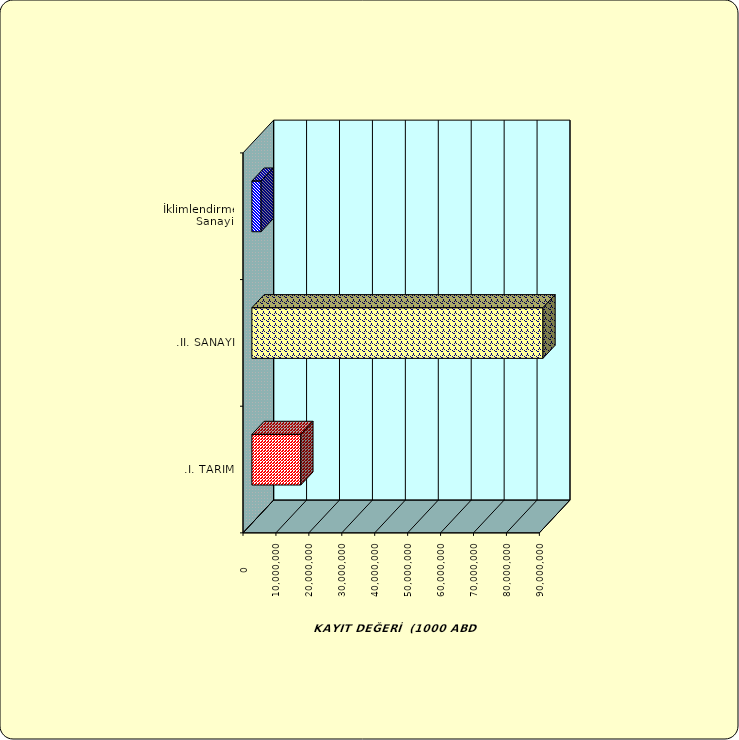
| Category | Series 0 |
|---|---|
| .I. TARIM | 14856409.396 |
| .II. SANAYİ | 88393618.878 |
|  İklimlendirme Sanayii | 2795562.566 |